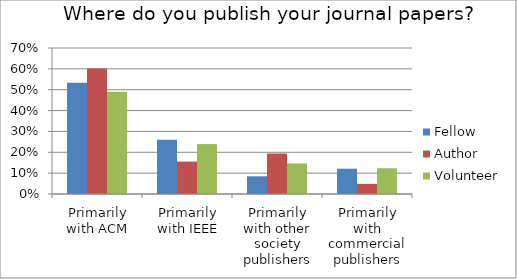
| Category | Fellow | Author | Volunteer |
|---|---|---|---|
| Primarily with ACM | 0.533 | 0.602 | 0.49 |
| Primarily with IEEE | 0.261 | 0.155 | 0.239 |
| Primarily with other society publishers | 0.085 | 0.194 | 0.147 |
| Primarily with commercial publishers | 0.121 | 0.049 | 0.124 |